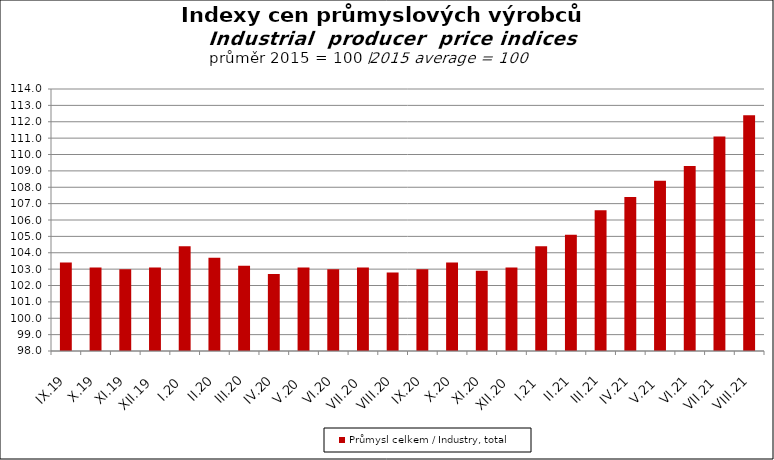
| Category | Průmysl celkem / Industry, total |
|---|---|
| IX.19 | 103.4 |
| X.19 | 103.1 |
| XI.19 | 103 |
| XII.19 | 103.1 |
| I.20 | 104.4 |
| II.20 | 103.7 |
| III.20 | 103.2 |
| IV.20 | 102.7 |
| V.20 | 103.1 |
| VI.20 | 103 |
| VII.20 | 103.1 |
| VIII.20 | 102.8 |
| IX.20 | 103 |
| X.20 | 103.4 |
| XI.20 | 102.9 |
| XII.20 | 103.1 |
| I.21 | 104.4 |
| II.21 | 105.1 |
| III.21 | 106.6 |
| IV.21 | 107.4 |
| V.21 | 108.4 |
| VI.21 | 109.3 |
| VII.21 | 111.1 |
| VIII.21 | 112.4 |